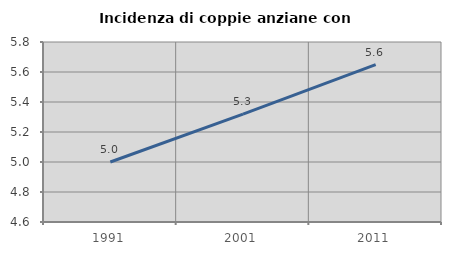
| Category | Incidenza di coppie anziane con figli |
|---|---|
| 1991.0 | 5 |
| 2001.0 | 5.319 |
| 2011.0 | 5.65 |